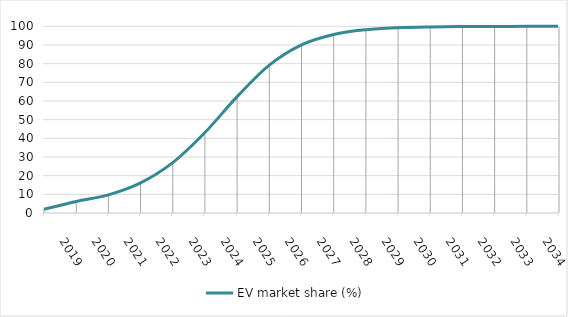
| Category | EV market share (%) |
|---|---|
| 2019.0 | 2 |
| 2020.0 | 6.167 |
| 2021.0 | 9.738 |
| 2022.0 | 16.146 |
| 2023.0 | 26.975 |
| 2024.0 | 43.106 |
| 2025.0 | 62.326 |
| 2026.0 | 79.181 |
| 2027.0 | 90.048 |
| 2028.0 | 95.638 |
| 2029.0 | 98.168 |
| 2030.0 | 99.245 |
| 2031.0 | 99.691 |
| 2032.0 | 99.874 |
| 2033.0 | 99.949 |
| 2034.0 | 99.979 |
| 2035.0 | 99.992 |